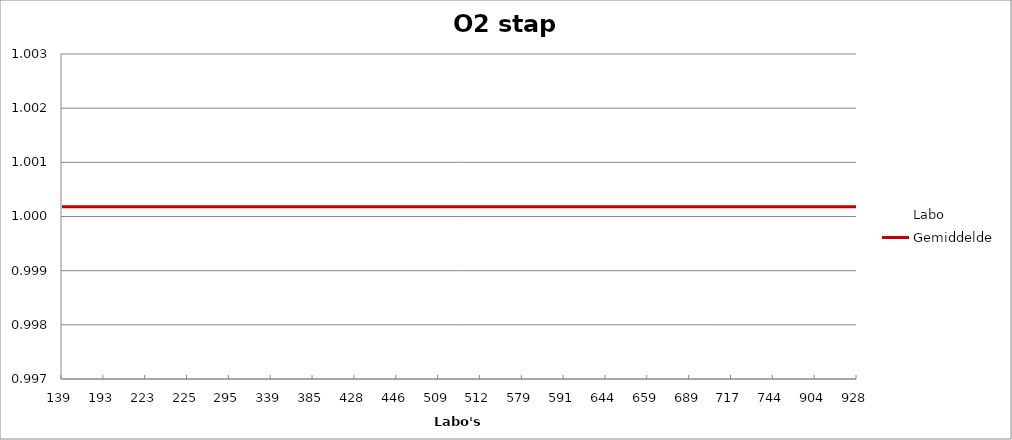
| Category | Labo | Gemiddelde |
|---|---|---|
| 139.0 | 1.002 | 1 |
| 193.0 | 1 | 1 |
| 223.0 | 1.001 | 1 |
| 225.0 | 1.001 | 1 |
| 295.0 | 1 | 1 |
| 339.0 | 1 | 1 |
| 385.0 | 1 | 1 |
| 428.0 | 1 | 1 |
| 446.0 | 1 | 1 |
| 509.0 | 1 | 1 |
| 512.0 | 1 | 1 |
| 579.0 | 1.001 | 1 |
| 591.0 | 1.001 | 1 |
| 644.0 | 0.999 | 1 |
| 659.0 | 1 | 1 |
| 689.0 | 1 | 1 |
| 717.0 | 0.999 | 1 |
| 744.0 | 1 | 1 |
| 904.0 | 1 | 1 |
| 928.0 | 0.997 | 1 |